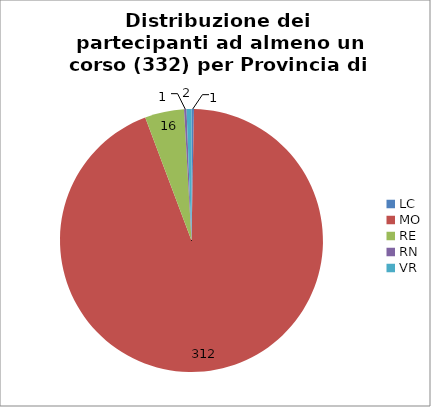
| Category | Nr. Tesserati |
|---|---|
| LC | 1 |
| MO | 312 |
| RE | 16 |
| RN | 1 |
| VR | 2 |